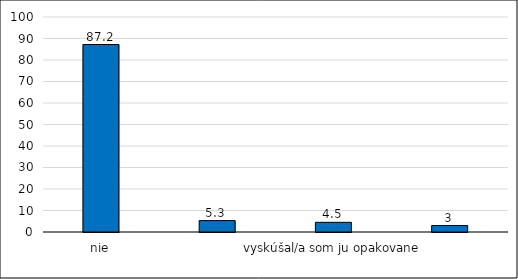
| Category | Series 0 |
|---|---|
| nie | 87.2 |
| vyskúšal/a som drogu raz | 5.3 |
| vyskúšal/a som ju opakovane | 4.5 |
| ak bola príležitosť, opakovane som sa k nej vracal/a | 3 |